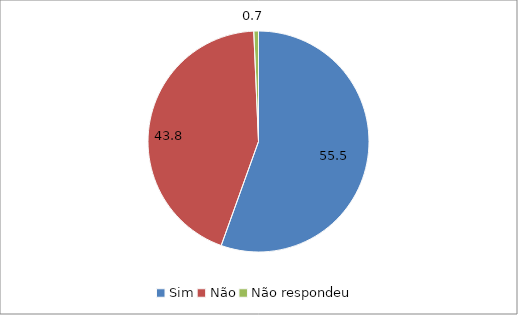
| Category | Series 0 |
|---|---|
| Sim | 55.479 |
| Não | 43.836 |
| Não respondeu | 0.685 |